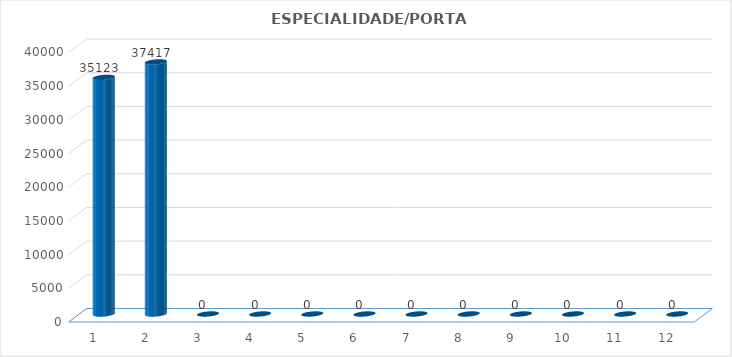
| Category | Series 0 |
|---|---|
| 0 | 35123 |
| 1 | 37417 |
| 2 | 0 |
| 3 | 0 |
| 4 | 0 |
| 5 | 0 |
| 6 | 0 |
| 7 | 0 |
| 8 | 0 |
| 9 | 0 |
| 10 | 0 |
| 11 | 0 |